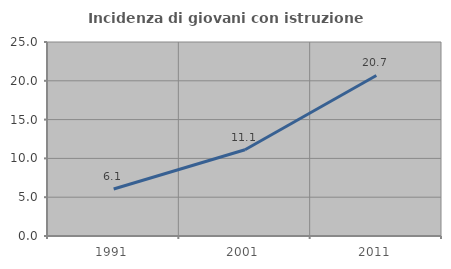
| Category | Incidenza di giovani con istruzione universitaria |
|---|---|
| 1991.0 | 6.061 |
| 2001.0 | 11.121 |
| 2011.0 | 20.69 |